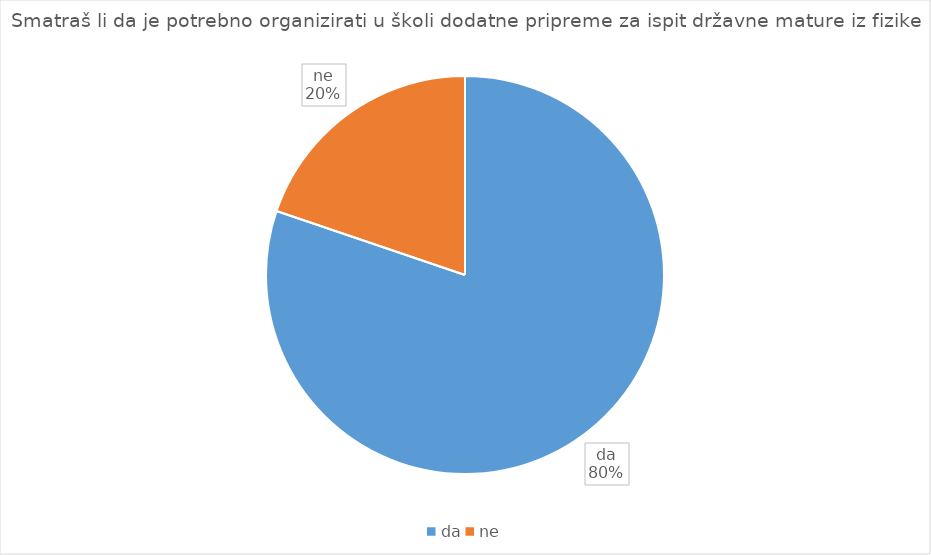
| Category | Series 0 |
|---|---|
| da | 77 |
| ne | 19 |